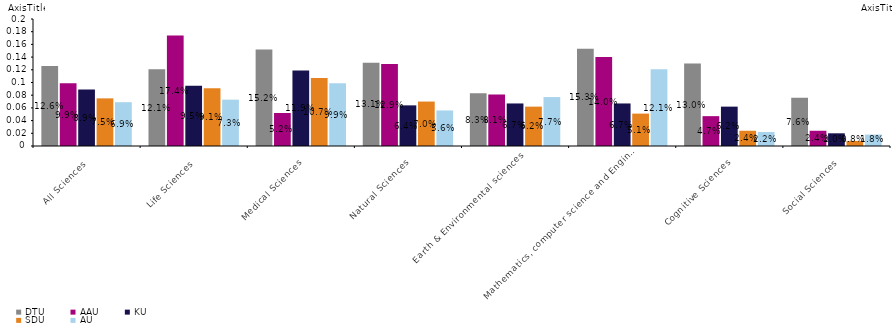
| Category | DTU | AAU | KU | SDU | AU |
|---|---|---|---|---|---|
| All Sciences | 0.126 | 0.099 | 0.089 | 0.075 | 0.069 |
| Life Sciences | 0.121 | 0.174 | 0.095 | 0.091 | 0.073 |
| Medical Sciences | 0.152 | 0.052 | 0.119 | 0.107 | 0.099 |
| Natural Sciences | 0.131 | 0.129 | 0.064 | 0.07 | 0.056 |
| Earth & Environmental sciences | 0.083 | 0.081 | 0.067 | 0.062 | 0.077 |
| Mathematics, computer science and Engineering | 0.153 | 0.14 | 0.067 | 0.051 | 0.121 |
| Cognitive Sciences | 0.13 | 0.047 | 0.062 | 0.024 | 0.022 |
| Social Sciences | 0.076 | 0.024 | 0.02 | 0.008 | 0.018 |